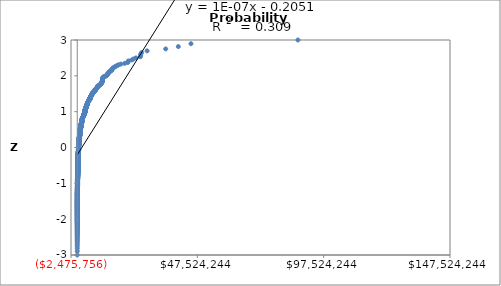
| Category | Normal Plot |
|---|---|
| 185.0 | -3.46 |
| 300.0 | -3.152 |
| 350.0 | -3 |
| 387.0 | -2.896 |
| 600.0 | -2.816 |
| 609.0 | -2.751 |
| 800.0 | -2.696 |
| 901.0 | -2.648 |
| 1362.0 | -2.605 |
| 1650.0 | -2.567 |
| 1725.0 | -2.532 |
| 1800.0 | -2.5 |
| 1860.0 | -2.471 |
| 2000.0 | -2.443 |
| 2304.0 | -2.417 |
| 2348.0 | -2.393 |
| 2800.0 | -2.37 |
| 2884.0 | -2.348 |
| 3000.0 | -2.327 |
| 3147.0 | -2.307 |
| 5000.0 | -2.288 |
| 5000.0 | -2.27 |
| 5000.0 | -2.253 |
| 5000.0 | -2.236 |
| 5333.0 | -2.22 |
| 6000.0 | -2.204 |
| 7500.0 | -2.189 |
| 7500.0 | -2.174 |
| 7629.0 | -2.16 |
| 8000.0 | -2.146 |
| 9950.0 | -2.133 |
| 9999.0 | -2.12 |
| 10000.0 | -2.107 |
| 10000.0 | -2.095 |
| 10000.0 | -2.083 |
| 10000.0 | -2.071 |
| 10000.0 | -2.06 |
| 10000.0 | -2.049 |
| 10000.0 | -2.038 |
| 10000.0 | -2.027 |
| 10000.0 | -2.017 |
| 10000.0 | -2.007 |
| 10000.0 | -1.997 |
| 10000.0 | -1.987 |
| 10000.0 | -1.977 |
| 10000.0 | -1.968 |
| 10000.0 | -1.958 |
| 10000.0 | -1.949 |
| 10000.0 | -1.94 |
| 10000.0 | -1.931 |
| 10000.0 | -1.923 |
| 10000.0 | -1.914 |
| 10000.0 | -1.906 |
| 10000.0 | -1.898 |
| 10000.0 | -1.89 |
| 10000.0 | -1.882 |
| 10500.0 | -1.874 |
| 10500.0 | -1.866 |
| 12000.0 | -1.858 |
| 12000.0 | -1.851 |
| 12327.0 | -1.843 |
| 13512.0 | -1.836 |
| 14657.0 | -1.829 |
| 14670.0 | -1.821 |
| 15000.0 | -1.814 |
| 15000.0 | -1.807 |
| 15213.0 | -1.801 |
| 15461.0 | -1.794 |
| 16100.0 | -1.787 |
| 17240.0 | -1.78 |
| 18750.0 | -1.774 |
| 19000.0 | -1.767 |
| 19490.0 | -1.761 |
| 20000.0 | -1.755 |
| 20000.0 | -1.748 |
| 20000.0 | -1.742 |
| 20000.0 | -1.736 |
| 20000.0 | -1.73 |
| 20000.0 | -1.724 |
| 21000.0 | -1.718 |
| 21000.0 | -1.712 |
| 21080.0 | -1.706 |
| 21563.0 | -1.7 |
| 22263.0 | -1.695 |
| 23000.0 | -1.689 |
| 23476.0 | -1.683 |
| 24000.0 | -1.678 |
| 24500.0 | -1.672 |
| 25000.0 | -1.667 |
| 25000.0 | -1.662 |
| 25000.0 | -1.656 |
| 25000.0 | -1.651 |
| 25000.0 | -1.646 |
| 25000.0 | -1.64 |
| 25000.0 | -1.635 |
| 25000.0 | -1.63 |
| 25000.0 | -1.625 |
| 25000.0 | -1.62 |
| 25000.0 | -1.615 |
| 25000.0 | -1.61 |
| 25000.0 | -1.605 |
| 25000.0 | -1.6 |
| 25000.0 | -1.595 |
| 25000.0 | -1.591 |
| 25000.0 | -1.586 |
| 26724.0 | -1.581 |
| 27473.0 | -1.576 |
| 27500.0 | -1.572 |
| 27727.0 | -1.567 |
| 27890.0 | -1.562 |
| 27945.0 | -1.558 |
| 30000.0 | -1.553 |
| 30000.0 | -1.549 |
| 30000.0 | -1.544 |
| 30000.0 | -1.54 |
| 30000.0 | -1.535 |
| 30000.0 | -1.531 |
| 30000.0 | -1.527 |
| 30000.0 | -1.522 |
| 30000.0 | -1.518 |
| 30000.0 | -1.514 |
| 30000.0 | -1.51 |
| 30250.0 | -1.505 |
| 31000.0 | -1.501 |
| 31715.0 | -1.497 |
| 35000.0 | -1.493 |
| 35000.0 | -1.489 |
| 35000.0 | -1.485 |
| 36018.0 | -1.481 |
| 36540.0 | -1.477 |
| 36540.0 | -1.473 |
| 38420.0 | -1.469 |
| 39280.0 | -1.465 |
| 39600.0 | -1.461 |
| 39900.0 | -1.457 |
| 40000.0 | -1.453 |
| 40000.0 | -1.449 |
| 40000.0 | -1.445 |
| 40000.0 | -1.441 |
| 40000.0 | -1.438 |
| 40100.0 | -1.434 |
| 40282.0 | -1.43 |
| 42000.0 | -1.426 |
| 42186.0 | -1.422 |
| 42500.0 | -1.419 |
| 45000.0 | -1.415 |
| 47810.0 | -1.411 |
| 47902.0 | -1.408 |
| 48449.0 | -1.404 |
| 48907.0 | -1.401 |
| 49500.0 | -1.397 |
| 49531.0 | -1.393 |
| 49864.0 | -1.39 |
| 49949.0 | -1.386 |
| 49996.0 | -1.383 |
| 50000.0 | -1.379 |
| 50000.0 | -1.376 |
| 50000.0 | -1.372 |
| 50000.0 | -1.369 |
| 50000.0 | -1.365 |
| 50000.0 | -1.362 |
| 50000.0 | -1.358 |
| 50000.0 | -1.355 |
| 50000.0 | -1.352 |
| 50000.0 | -1.348 |
| 50000.0 | -1.345 |
| 50000.0 | -1.342 |
| 50000.0 | -1.338 |
| 50000.0 | -1.335 |
| 50000.0 | -1.332 |
| 50000.0 | -1.328 |
| 50000.0 | -1.325 |
| 50000.0 | -1.322 |
| 50000.0 | -1.319 |
| 50000.0 | -1.315 |
| 50000.0 | -1.312 |
| 50000.0 | -1.309 |
| 50000.0 | -1.306 |
| 50000.0 | -1.303 |
| 50000.0 | -1.3 |
| 50000.0 | -1.296 |
| 50000.0 | -1.293 |
| 50000.0 | -1.29 |
| 50000.0 | -1.287 |
| 50000.0 | -1.284 |
| 50000.0 | -1.281 |
| 50000.0 | -1.278 |
| 50388.0 | -1.275 |
| 50527.0 | -1.272 |
| 51500.0 | -1.269 |
| 51700.0 | -1.266 |
| 53500.0 | -1.263 |
| 53763.0 | -1.26 |
| 54000.0 | -1.257 |
| 56245.0 | -1.254 |
| 59100.0 | -1.251 |
| 60000.0 | -1.248 |
| 60000.0 | -1.245 |
| 60000.0 | -1.242 |
| 60000.0 | -1.239 |
| 60000.0 | -1.236 |
| 60614.0 | -1.233 |
| 61050.0 | -1.23 |
| 61929.0 | -1.227 |
| 63300.0 | -1.225 |
| 64518.0 | -1.222 |
| 65000.0 | -1.219 |
| 66400.0 | -1.216 |
| 68500.0 | -1.213 |
| 68800.0 | -1.21 |
| 70000.0 | -1.208 |
| 70116.0 | -1.205 |
| 71166.0 | -1.202 |
| 74219.0 | -1.199 |
| 74290.0 | -1.196 |
| 74800.0 | -1.194 |
| 74871.0 | -1.191 |
| 74900.0 | -1.188 |
| 74963.0 | -1.185 |
| 74998.0 | -1.183 |
| 75000.0 | -1.18 |
| 75000.0 | -1.177 |
| 75000.0 | -1.175 |
| 75000.0 | -1.172 |
| 75000.0 | -1.169 |
| 75000.0 | -1.167 |
| 75000.0 | -1.164 |
| 75000.0 | -1.161 |
| 75000.0 | -1.159 |
| 75000.0 | -1.156 |
| 75000.0 | -1.153 |
| 75000.0 | -1.151 |
| 75000.0 | -1.148 |
| 75000.0 | -1.145 |
| 75000.0 | -1.143 |
| 75000.0 | -1.14 |
| 75000.0 | -1.138 |
| 75000.0 | -1.135 |
| 75000.0 | -1.133 |
| 75820.0 | -1.13 |
| 75970.0 | -1.127 |
| 77367.0 | -1.125 |
| 78200.0 | -1.122 |
| 79115.0 | -1.12 |
| 80000.0 | -1.117 |
| 80000.0 | -1.115 |
| 80000.0 | -1.112 |
| 80426.0 | -1.11 |
| 81000.0 | -1.107 |
| 82500.0 | -1.105 |
| 82800.0 | -1.102 |
| 85000.0 | -1.1 |
| 85000.0 | -1.097 |
| 85977.0 | -1.095 |
| 86000.0 | -1.092 |
| 87028.0 | -1.09 |
| 88000.0 | -1.087 |
| 90000.0 | -1.085 |
| 90000.0 | -1.083 |
| 91200.0 | -1.08 |
| 91300.0 | -1.078 |
| 93000.0 | -1.075 |
| 93452.0 | -1.073 |
| 94500.0 | -1.07 |
| 96000.0 | -1.068 |
| 98223.0 | -1.066 |
| 99080.0 | -1.063 |
| 99400.0 | -1.061 |
| 99500.0 | -1.059 |
| 99651.0 | -1.056 |
| 99858.0 | -1.054 |
| 99902.0 | -1.051 |
| 99964.0 | -1.049 |
| 99997.0 | -1.047 |
| 99998.0 | -1.044 |
| 99999.0 | -1.042 |
| 100000.0 | -1.04 |
| 100000.0 | -1.037 |
| 100000.0 | -1.035 |
| 100000.0 | -1.033 |
| 100000.0 | -1.031 |
| 100000.0 | -1.028 |
| 100000.0 | -1.026 |
| 100000.0 | -1.024 |
| 100000.0 | -1.021 |
| 100000.0 | -1.019 |
| 100000.0 | -1.017 |
| 100000.0 | -1.015 |
| 100000.0 | -1.012 |
| 100000.0 | -1.01 |
| 100000.0 | -1.008 |
| 100000.0 | -1.006 |
| 100000.0 | -1.003 |
| 100000.0 | -1.001 |
| 100000.0 | -0.999 |
| 100000.0 | -0.997 |
| 100000.0 | -0.994 |
| 100000.0 | -0.992 |
| 100000.0 | -0.99 |
| 100000.0 | -0.988 |
| 100000.0 | -0.986 |
| 100000.0 | -0.983 |
| 100000.0 | -0.981 |
| 100000.0 | -0.979 |
| 100000.0 | -0.977 |
| 100000.0 | -0.975 |
| 100000.0 | -0.972 |
| 100000.0 | -0.97 |
| 100000.0 | -0.968 |
| 100000.0 | -0.966 |
| 100000.0 | -0.964 |
| 100000.0 | -0.962 |
| 100000.0 | -0.96 |
| 100000.0 | -0.957 |
| 100000.0 | -0.955 |
| 100000.0 | -0.953 |
| 100000.0 | -0.951 |
| 100000.0 | -0.949 |
| 100000.0 | -0.947 |
| 100000.0 | -0.945 |
| 100000.0 | -0.943 |
| 100000.0 | -0.94 |
| 100000.0 | -0.938 |
| 100000.0 | -0.936 |
| 100000.0 | -0.934 |
| 100000.0 | -0.932 |
| 100000.0 | -0.93 |
| 100000.0 | -0.928 |
| 100000.0 | -0.926 |
| 100000.0 | -0.924 |
| 100000.0 | -0.922 |
| 100000.0 | -0.92 |
| 100000.0 | -0.918 |
| 100001.0 | -0.915 |
| 100001.0 | -0.913 |
| 100007.0 | -0.911 |
| 100013.0 | -0.909 |
| 100025.0 | -0.907 |
| 100034.0 | -0.905 |
| 100098.0 | -0.903 |
| 100239.0 | -0.901 |
| 101965.0 | -0.899 |
| 103000.0 | -0.897 |
| 104000.0 | -0.895 |
| 105000.0 | -0.893 |
| 106875.0 | -0.891 |
| 110000.0 | -0.889 |
| 110000.0 | -0.887 |
| 110000.0 | -0.885 |
| 110610.0 | -0.883 |
| 110700.0 | -0.881 |
| 111042.0 | -0.879 |
| 111376.0 | -0.877 |
| 115000.0 | -0.875 |
| 115000.0 | -0.873 |
| 115000.0 | -0.871 |
| 115650.0 | -0.869 |
| 119823.0 | -0.867 |
| 120458.0 | -0.865 |
| 121638.0 | -0.863 |
| 122213.0 | -0.861 |
| 122404.0 | -0.859 |
| 122981.0 | -0.857 |
| 124200.0 | -0.855 |
| 124757.0 | -0.853 |
| 125000.0 | -0.851 |
| 125000.0 | -0.85 |
| 125000.0 | -0.848 |
| 125000.0 | -0.846 |
| 125000.0 | -0.844 |
| 125000.0 | -0.842 |
| 125000.0 | -0.84 |
| 125000.0 | -0.838 |
| 125104.0 | -0.836 |
| 125962.0 | -0.834 |
| 129150.0 | -0.832 |
| 131250.0 | -0.83 |
| 131417.0 | -0.828 |
| 132000.0 | -0.826 |
| 132907.0 | -0.825 |
| 134000.0 | -0.823 |
| 134281.0 | -0.821 |
| 135000.0 | -0.819 |
| 135001.0 | -0.817 |
| 136400.0 | -0.815 |
| 137500.0 | -0.813 |
| 139438.0 | -0.811 |
| 139950.0 | -0.809 |
| 140000.0 | -0.808 |
| 140000.0 | -0.806 |
| 140000.0 | -0.804 |
| 143600.0 | -0.802 |
| 143973.0 | -0.8 |
| 144650.0 | -0.798 |
| 144917.0 | -0.796 |
| 146221.0 | -0.795 |
| 146337.0 | -0.793 |
| 147920.0 | -0.791 |
| 148930.0 | -0.789 |
| 149644.0 | -0.787 |
| 149733.0 | -0.785 |
| 149950.0 | -0.783 |
| 150000.0 | -0.782 |
| 150000.0 | -0.78 |
| 150000.0 | -0.778 |
| 150000.0 | -0.776 |
| 150000.0 | -0.774 |
| 150000.0 | -0.772 |
| 150000.0 | -0.771 |
| 150000.0 | -0.769 |
| 150000.0 | -0.767 |
| 150000.0 | -0.765 |
| 150000.0 | -0.763 |
| 150000.0 | -0.762 |
| 150000.0 | -0.76 |
| 150000.0 | -0.758 |
| 150000.0 | -0.756 |
| 150000.0 | -0.754 |
| 150000.0 | -0.753 |
| 150000.0 | -0.751 |
| 150000.0 | -0.749 |
| 150000.0 | -0.747 |
| 150000.0 | -0.745 |
| 150000.0 | -0.744 |
| 150003.0 | -0.742 |
| 150834.0 | -0.74 |
| 151019.0 | -0.738 |
| 151125.0 | -0.737 |
| 151200.0 | -0.735 |
| 151431.0 | -0.733 |
| 152232.0 | -0.731 |
| 152513.0 | -0.729 |
| 152900.0 | -0.728 |
| 154347.0 | -0.726 |
| 156000.0 | -0.724 |
| 158400.0 | -0.722 |
| 160400.0 | -0.721 |
| 160950.0 | -0.719 |
| 168755.0 | -0.717 |
| 170000.0 | -0.715 |
| 170000.0 | -0.714 |
| 170000.0 | -0.712 |
| 170023.0 | -0.71 |
| 171000.0 | -0.708 |
| 172000.0 | -0.707 |
| 175000.0 | -0.705 |
| 175000.0 | -0.703 |
| 175000.0 | -0.701 |
| 175000.0 | -0.7 |
| 175644.0 | -0.698 |
| 179015.0 | -0.696 |
| 179482.0 | -0.695 |
| 179600.0 | -0.693 |
| 180000.0 | -0.691 |
| 180000.0 | -0.689 |
| 180000.0 | -0.688 |
| 182000.0 | -0.686 |
| 182600.0 | -0.684 |
| 185840.0 | -0.683 |
| 186792.0 | -0.681 |
| 187000.0 | -0.679 |
| 189275.0 | -0.677 |
| 189886.0 | -0.676 |
| 189956.0 | -0.674 |
| 191600.0 | -0.672 |
| 191950.0 | -0.671 |
| 195967.0 | -0.669 |
| 198000.0 | -0.667 |
| 198206.0 | -0.666 |
| 198704.0 | -0.664 |
| 199665.0 | -0.662 |
| 199984.0 | -0.661 |
| 199990.0 | -0.659 |
| 200000.0 | -0.657 |
| 200000.0 | -0.656 |
| 200000.0 | -0.654 |
| 200000.0 | -0.652 |
| 200000.0 | -0.65 |
| 200000.0 | -0.649 |
| 200000.0 | -0.647 |
| 200000.0 | -0.645 |
| 200000.0 | -0.644 |
| 200000.0 | -0.642 |
| 200000.0 | -0.64 |
| 200000.0 | -0.639 |
| 200000.0 | -0.637 |
| 200000.0 | -0.636 |
| 200000.0 | -0.634 |
| 200000.0 | -0.632 |
| 200000.0 | -0.631 |
| 200000.0 | -0.629 |
| 200000.0 | -0.627 |
| 200000.0 | -0.626 |
| 200000.0 | -0.624 |
| 200000.0 | -0.622 |
| 200000.0 | -0.621 |
| 200000.0 | -0.619 |
| 200000.0 | -0.617 |
| 200000.0 | -0.616 |
| 200000.0 | -0.614 |
| 200000.0 | -0.613 |
| 200000.0 | -0.611 |
| 200001.0 | -0.609 |
| 200002.0 | -0.608 |
| 200360.0 | -0.606 |
| 200360.0 | -0.604 |
| 200650.0 | -0.603 |
| 200800.0 | -0.601 |
| 201600.0 | -0.599 |
| 201700.0 | -0.598 |
| 202500.0 | -0.596 |
| 204988.0 | -0.595 |
| 208000.0 | -0.593 |
| 208950.0 | -0.591 |
| 209200.0 | -0.59 |
| 210000.0 | -0.588 |
| 210000.0 | -0.587 |
| 210000.0 | -0.585 |
| 210000.0 | -0.583 |
| 210360.0 | -0.582 |
| 211795.0 | -0.58 |
| 212000.0 | -0.579 |
| 213000.0 | -0.577 |
| 213000.0 | -0.575 |
| 213750.0 | -0.574 |
| 214808.0 | -0.572 |
| 215000.0 | -0.571 |
| 215000.0 | -0.569 |
| 216000.0 | -0.567 |
| 217200.0 | -0.566 |
| 218567.0 | -0.564 |
| 221250.0 | -0.563 |
| 221755.0 | -0.561 |
| 222000.0 | -0.559 |
| 224000.0 | -0.558 |
| 224030.0 | -0.556 |
| 225000.0 | -0.555 |
| 225000.0 | -0.553 |
| 227200.0 | -0.552 |
| 227352.0 | -0.55 |
| 228150.0 | -0.548 |
| 230000.0 | -0.547 |
| 231382.0 | -0.545 |
| 231846.0 | -0.544 |
| 234450.0 | -0.542 |
| 235000.0 | -0.541 |
| 235150.0 | -0.539 |
| 238080.0 | -0.537 |
| 238500.0 | -0.536 |
| 239796.0 | -0.534 |
| 240000.0 | -0.533 |
| 240000.0 | -0.531 |
| 241747.0 | -0.53 |
| 242000.0 | -0.528 |
| 242580.0 | -0.527 |
| 244733.0 | -0.525 |
| 244924.0 | -0.523 |
| 245534.0 | -0.522 |
| 246070.0 | -0.52 |
| 247333.0 | -0.519 |
| 247465.0 | -0.517 |
| 248250.0 | -0.516 |
| 248343.0 | -0.514 |
| 248760.0 | -0.513 |
| 249113.0 | -0.511 |
| 249290.0 | -0.51 |
| 249396.0 | -0.508 |
| 249445.0 | -0.506 |
| 249471.0 | -0.505 |
| 249482.0 | -0.503 |
| 249505.0 | -0.502 |
| 249612.0 | -0.5 |
| 249700.0 | -0.499 |
| 249727.0 | -0.497 |
| 249808.0 | -0.496 |
| 249826.0 | -0.494 |
| 249830.0 | -0.493 |
| 249855.0 | -0.491 |
| 249939.0 | -0.49 |
| 249994.0 | -0.488 |
| 250000.0 | -0.487 |
| 250000.0 | -0.485 |
| 250000.0 | -0.484 |
| 250000.0 | -0.482 |
| 250000.0 | -0.481 |
| 250000.0 | -0.479 |
| 250000.0 | -0.477 |
| 250000.0 | -0.476 |
| 250000.0 | -0.474 |
| 250000.0 | -0.473 |
| 250000.0 | -0.471 |
| 250000.0 | -0.47 |
| 250000.0 | -0.468 |
| 250000.0 | -0.467 |
| 250000.0 | -0.465 |
| 250000.0 | -0.464 |
| 250000.0 | -0.462 |
| 250000.0 | -0.461 |
| 250000.0 | -0.459 |
| 250000.0 | -0.458 |
| 250000.0 | -0.456 |
| 250000.0 | -0.455 |
| 250000.0 | -0.453 |
| 250000.0 | -0.452 |
| 250000.0 | -0.45 |
| 250000.0 | -0.449 |
| 250000.0 | -0.447 |
| 250000.0 | -0.446 |
| 250000.0 | -0.444 |
| 250000.0 | -0.443 |
| 250000.0 | -0.441 |
| 250000.0 | -0.44 |
| 250000.0 | -0.438 |
| 250000.0 | -0.437 |
| 250000.0 | -0.435 |
| 250000.0 | -0.434 |
| 250000.0 | -0.432 |
| 250000.0 | -0.431 |
| 250000.0 | -0.429 |
| 250000.0 | -0.428 |
| 250000.0 | -0.427 |
| 250000.0 | -0.425 |
| 250249.0 | -0.424 |
| 250400.0 | -0.422 |
| 250669.0 | -0.421 |
| 250675.0 | -0.419 |
| 253482.0 | -0.418 |
| 254400.0 | -0.416 |
| 255394.0 | -0.415 |
| 257391.0 | -0.413 |
| 257675.0 | -0.412 |
| 259895.0 | -0.41 |
| 260000.0 | -0.409 |
| 260000.0 | -0.407 |
| 260760.0 | -0.406 |
| 262003.0 | -0.404 |
| 262500.0 | -0.403 |
| 263400.0 | -0.401 |
| 264500.0 | -0.4 |
| 270000.0 | -0.399 |
| 270492.0 | -0.397 |
| 272914.0 | -0.396 |
| 274999.0 | -0.394 |
| 275000.0 | -0.393 |
| 277044.0 | -0.391 |
| 280000.0 | -0.39 |
| 281217.0 | -0.388 |
| 281800.0 | -0.387 |
| 285368.0 | -0.385 |
| 285714.0 | -0.384 |
| 286500.0 | -0.382 |
| 286600.0 | -0.381 |
| 289899.0 | -0.38 |
| 289937.0 | -0.378 |
| 290939.0 | -0.377 |
| 291070.0 | -0.375 |
| 293024.0 | -0.374 |
| 296000.0 | -0.372 |
| 297045.0 | -0.371 |
| 297800.0 | -0.369 |
| 298000.0 | -0.368 |
| 298176.0 | -0.367 |
| 299263.0 | -0.365 |
| 299363.0 | -0.364 |
| 299384.0 | -0.362 |
| 299444.0 | -0.361 |
| 299902.0 | -0.359 |
| 299985.0 | -0.358 |
| 300000.0 | -0.356 |
| 300000.0 | -0.355 |
| 300000.0 | -0.354 |
| 300000.0 | -0.352 |
| 300000.0 | -0.351 |
| 300000.0 | -0.349 |
| 300000.0 | -0.348 |
| 300000.0 | -0.346 |
| 300000.0 | -0.345 |
| 300000.0 | -0.343 |
| 300000.0 | -0.342 |
| 300000.0 | -0.341 |
| 300000.0 | -0.339 |
| 300000.0 | -0.338 |
| 300000.0 | -0.336 |
| 300000.0 | -0.335 |
| 300000.0 | -0.333 |
| 300000.0 | -0.332 |
| 300000.0 | -0.331 |
| 300000.0 | -0.329 |
| 300000.0 | -0.328 |
| 300000.0 | -0.326 |
| 300000.0 | -0.325 |
| 300000.0 | -0.323 |
| 300000.0 | -0.322 |
| 300000.0 | -0.321 |
| 300000.0 | -0.319 |
| 300000.0 | -0.318 |
| 300000.0 | -0.316 |
| 300000.0 | -0.315 |
| 300000.0 | -0.313 |
| 300000.0 | -0.312 |
| 300000.0 | -0.311 |
| 300000.0 | -0.309 |
| 300000.0 | -0.308 |
| 300000.0 | -0.306 |
| 300000.0 | -0.305 |
| 300000.0 | -0.304 |
| 300000.0 | -0.302 |
| 300000.0 | -0.301 |
| 300008.0 | -0.299 |
| 300013.0 | -0.298 |
| 300250.0 | -0.296 |
| 300653.0 | -0.295 |
| 301451.0 | -0.294 |
| 302425.0 | -0.292 |
| 303850.0 | -0.291 |
| 306485.0 | -0.289 |
| 306500.0 | -0.288 |
| 308000.0 | -0.287 |
| 309554.0 | -0.285 |
| 310500.0 | -0.284 |
| 313000.0 | -0.282 |
| 314110.0 | -0.281 |
| 314996.0 | -0.28 |
| 319450.0 | -0.278 |
| 320000.0 | -0.277 |
| 322500.0 | -0.275 |
| 325000.0 | -0.274 |
| 325000.0 | -0.273 |
| 326000.0 | -0.271 |
| 328000.0 | -0.27 |
| 329034.0 | -0.268 |
| 330000.0 | -0.267 |
| 330008.0 | -0.266 |
| 330781.0 | -0.264 |
| 331512.0 | -0.263 |
| 331678.0 | -0.261 |
| 332992.0 | -0.26 |
| 333860.0 | -0.259 |
| 334100.0 | -0.257 |
| 334610.0 | -0.256 |
| 337000.0 | -0.254 |
| 341000.0 | -0.253 |
| 342576.0 | -0.252 |
| 345592.0 | -0.25 |
| 345592.0 | -0.249 |
| 346644.0 | -0.247 |
| 348288.0 | -0.246 |
| 350000.0 | -0.245 |
| 350000.0 | -0.243 |
| 350000.0 | -0.242 |
| 350000.0 | -0.24 |
| 350000.0 | -0.239 |
| 350000.0 | -0.238 |
| 350000.0 | -0.236 |
| 350238.0 | -0.235 |
| 350253.0 | -0.233 |
| 353977.0 | -0.232 |
| 354993.0 | -0.231 |
| 355460.0 | -0.229 |
| 356054.0 | -0.228 |
| 358915.0 | -0.226 |
| 361927.0 | -0.225 |
| 365000.0 | -0.224 |
| 369000.0 | -0.222 |
| 369623.0 | -0.221 |
| 370938.0 | -0.22 |
| 375000.0 | -0.218 |
| 375030.0 | -0.217 |
| 377646.0 | -0.215 |
| 378013.0 | -0.214 |
| 378500.0 | -0.213 |
| 383465.0 | -0.211 |
| 385801.0 | -0.21 |
| 386560.0 | -0.208 |
| 391089.0 | -0.207 |
| 395836.0 | -0.206 |
| 395931.0 | -0.204 |
| 396262.0 | -0.203 |
| 397036.0 | -0.202 |
| 397590.0 | -0.2 |
| 398534.0 | -0.199 |
| 398704.0 | -0.197 |
| 399471.0 | -0.196 |
| 399827.0 | -0.195 |
| 399953.0 | -0.193 |
| 399968.0 | -0.192 |
| 400000.0 | -0.191 |
| 400000.0 | -0.189 |
| 400000.0 | -0.188 |
| 400000.0 | -0.186 |
| 400000.0 | -0.185 |
| 400000.0 | -0.184 |
| 400000.0 | -0.182 |
| 400000.0 | -0.181 |
| 400000.0 | -0.18 |
| 400000.0 | -0.178 |
| 400000.0 | -0.177 |
| 400000.0 | -0.175 |
| 400000.0 | -0.174 |
| 400000.0 | -0.173 |
| 400000.0 | -0.171 |
| 400366.0 | -0.17 |
| 400381.0 | -0.169 |
| 405698.0 | -0.167 |
| 410929.0 | -0.166 |
| 411722.0 | -0.164 |
| 417517.0 | -0.163 |
| 417697.0 | -0.162 |
| 420002.0 | -0.16 |
| 420632.0 | -0.159 |
| 421752.0 | -0.158 |
| 423500.0 | -0.156 |
| 425000.0 | -0.155 |
| 425000.0 | -0.153 |
| 425000.0 | -0.152 |
| 427000.0 | -0.151 |
| 427000.0 | -0.149 |
| 430000.0 | -0.148 |
| 432898.0 | -0.147 |
| 436800.0 | -0.145 |
| 437807.0 | -0.144 |
| 442320.0 | -0.143 |
| 442884.0 | -0.141 |
| 445040.0 | -0.14 |
| 446564.0 | -0.138 |
| 449300.0 | -0.137 |
| 449750.0 | -0.136 |
| 450000.0 | -0.134 |
| 450000.0 | -0.133 |
| 450000.0 | -0.132 |
| 450000.0 | -0.13 |
| 450000.0 | -0.129 |
| 450000.0 | -0.128 |
| 450000.0 | -0.126 |
| 450000.0 | -0.125 |
| 450223.0 | -0.123 |
| 450675.0 | -0.122 |
| 455394.0 | -0.121 |
| 460000.0 | -0.119 |
| 464984.0 | -0.118 |
| 468433.0 | -0.117 |
| 468500.0 | -0.115 |
| 473573.0 | -0.114 |
| 475000.0 | -0.113 |
| 475000.0 | -0.111 |
| 475077.0 | -0.11 |
| 476553.0 | -0.108 |
| 476610.0 | -0.107 |
| 476683.0 | -0.106 |
| 477691.0 | -0.104 |
| 479000.0 | -0.103 |
| 479602.0 | -0.102 |
| 480000.0 | -0.1 |
| 481844.0 | -0.099 |
| 484948.0 | -0.098 |
| 487071.0 | -0.096 |
| 487475.0 | -0.095 |
| 490021.0 | -0.093 |
| 491310.0 | -0.092 |
| 494826.0 | -0.091 |
| 494933.0 | -0.089 |
| 494953.0 | -0.088 |
| 495337.0 | -0.087 |
| 496776.0 | -0.085 |
| 497499.0 | -0.084 |
| 497613.0 | -0.083 |
| 497639.0 | -0.081 |
| 497684.0 | -0.08 |
| 497752.0 | -0.079 |
| 497878.0 | -0.077 |
| 498055.0 | -0.076 |
| 498724.0 | -0.074 |
| 498857.0 | -0.073 |
| 499375.0 | -0.072 |
| 499547.0 | -0.07 |
| 499730.0 | -0.069 |
| 499783.0 | -0.068 |
| 499800.0 | -0.066 |
| 499951.0 | -0.065 |
| 499962.0 | -0.064 |
| 499989.0 | -0.062 |
| 499996.0 | -0.061 |
| 499997.0 | -0.06 |
| 500000.0 | -0.058 |
| 500000.0 | -0.057 |
| 500000.0 | -0.055 |
| 500000.0 | -0.054 |
| 500000.0 | -0.053 |
| 500000.0 | -0.051 |
| 500000.0 | -0.05 |
| 500000.0 | -0.049 |
| 500000.0 | -0.047 |
| 500000.0 | -0.046 |
| 500000.0 | -0.045 |
| 500000.0 | -0.043 |
| 500000.0 | -0.042 |
| 500000.0 | -0.041 |
| 500000.0 | -0.039 |
| 500000.0 | -0.038 |
| 500000.0 | -0.037 |
| 500000.0 | -0.035 |
| 500000.0 | -0.034 |
| 500000.0 | -0.032 |
| 500000.0 | -0.031 |
| 500000.0 | -0.03 |
| 500000.0 | -0.028 |
| 500000.0 | -0.027 |
| 500000.0 | -0.026 |
| 500000.0 | -0.024 |
| 500000.0 | -0.023 |
| 500000.0 | -0.022 |
| 500000.0 | -0.02 |
| 500000.0 | -0.019 |
| 500000.0 | -0.018 |
| 500000.0 | -0.016 |
| 500000.0 | -0.015 |
| 500000.0 | -0.014 |
| 500000.0 | -0.012 |
| 500000.0 | -0.011 |
| 500000.0 | -0.009 |
| 500000.0 | -0.008 |
| 500000.0 | -0.007 |
| 500000.0 | -0.005 |
| 500000.0 | -0.004 |
| 500000.0 | -0.003 |
| 500000.0 | -0.001 |
| 500000.0 | 0 |
| 500000.0 | 0.001 |
| 500000.0 | 0.003 |
| 500000.0 | 0.004 |
| 500000.0 | 0.005 |
| 500000.0 | 0.007 |
| 500000.0 | 0.008 |
| 500000.0 | 0.009 |
| 500000.0 | 0.011 |
| 500000.0 | 0.012 |
| 500000.0 | 0.014 |
| 500000.0 | 0.015 |
| 500000.0 | 0.016 |
| 500000.0 | 0.018 |
| 500000.0 | 0.019 |
| 500125.0 | 0.02 |
| 500187.0 | 0.022 |
| 500422.0 | 0.023 |
| 500543.0 | 0.024 |
| 500906.0 | 0.026 |
| 501485.0 | 0.027 |
| 501580.0 | 0.028 |
| 505500.0 | 0.03 |
| 505533.0 | 0.031 |
| 506504.0 | 0.032 |
| 511359.0 | 0.034 |
| 513219.0 | 0.035 |
| 513750.0 | 0.037 |
| 514872.0 | 0.038 |
| 517500.0 | 0.039 |
| 517670.0 | 0.041 |
| 517860.0 | 0.042 |
| 520446.0 | 0.043 |
| 525000.0 | 0.045 |
| 526960.0 | 0.046 |
| 531131.0 | 0.047 |
| 538967.0 | 0.049 |
| 539334.0 | 0.05 |
| 540000.0 | 0.051 |
| 546864.0 | 0.053 |
| 549489.0 | 0.054 |
| 550000.0 | 0.055 |
| 550000.0 | 0.057 |
| 550000.0 | 0.058 |
| 550000.0 | 0.06 |
| 550844.0 | 0.061 |
| 551336.0 | 0.062 |
| 553493.0 | 0.064 |
| 556006.0 | 0.065 |
| 557168.0 | 0.066 |
| 557743.0 | 0.068 |
| 558000.0 | 0.069 |
| 560000.0 | 0.07 |
| 563611.0 | 0.072 |
| 564323.0 | 0.073 |
| 566023.0 | 0.074 |
| 572533.0 | 0.076 |
| 574060.0 | 0.077 |
| 575000.0 | 0.079 |
| 576191.0 | 0.08 |
| 580000.0 | 0.081 |
| 582637.0 | 0.083 |
| 583531.0 | 0.084 |
| 583800.0 | 0.085 |
| 588559.0 | 0.087 |
| 590525.0 | 0.088 |
| 594035.0 | 0.089 |
| 595627.0 | 0.091 |
| 595859.0 | 0.092 |
| 597077.0 | 0.093 |
| 597228.0 | 0.095 |
| 599016.0 | 0.096 |
| 599947.0 | 0.098 |
| 600000.0 | 0.099 |
| 600000.0 | 0.1 |
| 600000.0 | 0.102 |
| 600000.0 | 0.103 |
| 600000.0 | 0.104 |
| 600000.0 | 0.106 |
| 600000.0 | 0.107 |
| 600000.0 | 0.108 |
| 600000.0 | 0.11 |
| 600000.0 | 0.111 |
| 600000.0 | 0.113 |
| 600223.0 | 0.114 |
| 600759.0 | 0.115 |
| 604973.0 | 0.117 |
| 606608.0 | 0.118 |
| 610819.0 | 0.119 |
| 614954.0 | 0.121 |
| 615590.0 | 0.122 |
| 621265.0 | 0.123 |
| 623035.0 | 0.125 |
| 625000.0 | 0.126 |
| 628761.0 | 0.128 |
| 635003.0 | 0.129 |
| 637532.0 | 0.13 |
| 637532.0 | 0.132 |
| 638620.0 | 0.133 |
| 642753.0 | 0.134 |
| 643881.0 | 0.136 |
| 646851.0 | 0.137 |
| 647000.0 | 0.138 |
| 650000.0 | 0.14 |
| 650000.0 | 0.141 |
| 650000.0 | 0.143 |
| 650000.0 | 0.144 |
| 650000.0 | 0.145 |
| 650000.0 | 0.147 |
| 650000.0 | 0.148 |
| 650000.0 | 0.149 |
| 652255.0 | 0.151 |
| 652493.0 | 0.152 |
| 653077.0 | 0.153 |
| 659788.0 | 0.155 |
| 667235.0 | 0.156 |
| 670156.0 | 0.158 |
| 670387.0 | 0.159 |
| 671361.0 | 0.16 |
| 672000.0 | 0.162 |
| 673378.0 | 0.163 |
| 674472.0 | 0.164 |
| 675000.0 | 0.166 |
| 675000.0 | 0.167 |
| 675000.0 | 0.169 |
| 685000.0 | 0.17 |
| 686784.0 | 0.171 |
| 689738.0 | 0.173 |
| 697310.0 | 0.174 |
| 698587.0 | 0.175 |
| 699104.0 | 0.177 |
| 700000.0 | 0.178 |
| 700000.0 | 0.18 |
| 700000.0 | 0.181 |
| 700000.0 | 0.182 |
| 700250.0 | 0.184 |
| 703737.0 | 0.185 |
| 721736.0 | 0.186 |
| 725000.0 | 0.188 |
| 726000.0 | 0.189 |
| 729916.0 | 0.191 |
| 733195.0 | 0.192 |
| 733793.0 | 0.193 |
| 742223.0 | 0.195 |
| 742996.0 | 0.196 |
| 743331.0 | 0.197 |
| 743550.0 | 0.199 |
| 744703.0 | 0.2 |
| 744844.0 | 0.202 |
| 750000.0 | 0.203 |
| 750000.0 | 0.204 |
| 750000.0 | 0.206 |
| 750000.0 | 0.207 |
| 750000.0 | 0.208 |
| 750000.0 | 0.21 |
| 750000.0 | 0.211 |
| 750000.0 | 0.213 |
| 750000.0 | 0.214 |
| 750000.0 | 0.215 |
| 750000.0 | 0.217 |
| 750000.0 | 0.218 |
| 750000.0 | 0.22 |
| 750000.0 | 0.221 |
| 750000.0 | 0.222 |
| 750000.0 | 0.224 |
| 750584.0 | 0.225 |
| 750772.0 | 0.226 |
| 751872.0 | 0.228 |
| 752332.0 | 0.229 |
| 753624.0 | 0.231 |
| 758910.0 | 0.232 |
| 760000.0 | 0.233 |
| 762476.0 | 0.235 |
| 768112.0 | 0.236 |
| 768794.0 | 0.238 |
| 775000.0 | 0.239 |
| 785194.0 | 0.24 |
| 791000.0 | 0.242 |
| 792216.0 | 0.243 |
| 797170.0 | 0.245 |
| 798160.0 | 0.246 |
| 798408.0 | 0.247 |
| 799221.0 | 0.249 |
| 799673.0 | 0.25 |
| 799759.0 | 0.252 |
| 799825.0 | 0.253 |
| 800000.0 | 0.254 |
| 800000.0 | 0.256 |
| 800000.0 | 0.257 |
| 800000.0 | 0.259 |
| 800000.0 | 0.26 |
| 800000.0 | 0.261 |
| 800000.0 | 0.263 |
| 800000.0 | 0.264 |
| 801808.0 | 0.266 |
| 809467.0 | 0.267 |
| 818471.0 | 0.268 |
| 820465.0 | 0.27 |
| 828653.0 | 0.271 |
| 831395.0 | 0.273 |
| 832969.0 | 0.274 |
| 837355.0 | 0.275 |
| 840000.0 | 0.277 |
| 840000.0 | 0.278 |
| 840000.0 | 0.28 |
| 850000.0 | 0.281 |
| 850000.0 | 0.282 |
| 850000.0 | 0.284 |
| 850000.0 | 0.285 |
| 855766.0 | 0.287 |
| 871202.0 | 0.288 |
| 871845.0 | 0.289 |
| 879000.0 | 0.291 |
| 879810.0 | 0.292 |
| 881000.0 | 0.294 |
| 883200.0 | 0.295 |
| 884417.0 | 0.296 |
| 885000.0 | 0.298 |
| 885130.0 | 0.299 |
| 886381.0 | 0.301 |
| 888638.0 | 0.302 |
| 892500.0 | 0.304 |
| 899021.0 | 0.305 |
| 899875.0 | 0.306 |
| 900000.0 | 0.308 |
| 900000.0 | 0.309 |
| 900000.0 | 0.311 |
| 900000.0 | 0.312 |
| 900000.0 | 0.313 |
| 900000.0 | 0.315 |
| 900000.0 | 0.316 |
| 900488.0 | 0.318 |
| 900900.0 | 0.319 |
| 910000.0 | 0.321 |
| 911500.0 | 0.322 |
| 911500.0 | 0.323 |
| 920000.0 | 0.325 |
| 922000.0 | 0.326 |
| 925111.0 | 0.328 |
| 931137.0 | 0.329 |
| 933529.0 | 0.331 |
| 937088.0 | 0.332 |
| 940148.0 | 0.333 |
| 942527.0 | 0.335 |
| 945261.0 | 0.336 |
| 950000.0 | 0.338 |
| 950000.0 | 0.339 |
| 950000.0 | 0.341 |
| 950548.0 | 0.342 |
| 951293.0 | 0.343 |
| 953184.0 | 0.345 |
| 959116.0 | 0.346 |
| 959373.0 | 0.348 |
| 959477.0 | 0.349 |
| 959989.0 | 0.351 |
| 960000.0 | 0.352 |
| 960000.0 | 0.354 |
| 965190.0 | 0.355 |
| 965738.0 | 0.356 |
| 971421.0 | 0.358 |
| 973166.0 | 0.359 |
| 974941.0 | 0.361 |
| 975000.0 | 0.362 |
| 978105.0 | 0.364 |
| 979000.0 | 0.365 |
| 981000.0 | 0.367 |
| 984559.0 | 0.368 |
| 986452.0 | 0.369 |
| 987000.0 | 0.371 |
| 987579.0 | 0.372 |
| 988320.0 | 0.374 |
| 989319.0 | 0.375 |
| 989929.0 | 0.377 |
| 992800.0 | 0.378 |
| 993219.0 | 0.38 |
| 993317.0 | 0.381 |
| 996185.0 | 0.382 |
| 997500.0 | 0.384 |
| 997614.0 | 0.385 |
| 998150.0 | 0.387 |
| 998221.0 | 0.388 |
| 999406.0 | 0.39 |
| 999566.0 | 0.391 |
| 999698.0 | 0.393 |
| 999795.0 | 0.394 |
| 999900.0 | 0.396 |
| 1000000.0 | 0.397 |
| 1000000.0 | 0.399 |
| 1000000.0 | 0.4 |
| 1000000.0 | 0.401 |
| 1000000.0 | 0.403 |
| 1000000.0 | 0.404 |
| 1000000.0 | 0.406 |
| 1000000.0 | 0.407 |
| 1000000.0 | 0.409 |
| 1000000.0 | 0.41 |
| 1000000.0 | 0.412 |
| 1000000.0 | 0.413 |
| 1000000.0 | 0.415 |
| 1000000.0 | 0.416 |
| 1000000.0 | 0.418 |
| 1000000.0 | 0.419 |
| 1000000.0 | 0.421 |
| 1000000.0 | 0.422 |
| 1000000.0 | 0.424 |
| 1000000.0 | 0.425 |
| 1000000.0 | 0.427 |
| 1000001.0 | 0.428 |
| 1000002.0 | 0.429 |
| 1000330.0 | 0.431 |
| 1000561.0 | 0.432 |
| 1001363.0 | 0.434 |
| 1002000.0 | 0.435 |
| 1004719.0 | 0.437 |
| 1021000.0 | 0.438 |
| 1038029.0 | 0.44 |
| 1047928.0 | 0.441 |
| 1053150.0 | 0.443 |
| 1054143.0 | 0.444 |
| 1058313.0 | 0.446 |
| 1068280.0 | 0.447 |
| 1070243.0 | 0.449 |
| 1076400.0 | 0.45 |
| 1077960.0 | 0.452 |
| 1095000.0 | 0.453 |
| 1099687.0 | 0.455 |
| 1100000.0 | 0.456 |
| 1100000.0 | 0.458 |
| 1100000.0 | 0.459 |
| 1111250.0 | 0.461 |
| 1112000.0 | 0.462 |
| 1116000.0 | 0.464 |
| 1118424.0 | 0.465 |
| 1123216.0 | 0.467 |
| 1125270.0 | 0.468 |
| 1130000.0 | 0.47 |
| 1137632.0 | 0.471 |
| 1144856.0 | 0.473 |
| 1150000.0 | 0.474 |
| 1153442.0 | 0.476 |
| 1159989.0 | 0.477 |
| 1163695.0 | 0.479 |
| 1168734.0 | 0.481 |
| 1172327.0 | 0.482 |
| 1175000.0 | 0.484 |
| 1179770.0 | 0.485 |
| 1181375.0 | 0.487 |
| 1189756.0 | 0.488 |
| 1194000.0 | 0.49 |
| 1195639.0 | 0.491 |
| 1200000.0 | 0.493 |
| 1200000.0 | 0.494 |
| 1200000.0 | 0.496 |
| 1200000.0 | 0.497 |
| 1200000.0 | 0.499 |
| 1200000.0 | 0.5 |
| 1200000.0 | 0.502 |
| 1200007.0 | 0.503 |
| 1205600.0 | 0.505 |
| 1221800.0 | 0.506 |
| 1224953.0 | 0.508 |
| 1229467.0 | 0.51 |
| 1229730.0 | 0.511 |
| 1233281.0 | 0.513 |
| 1235787.0 | 0.514 |
| 1243039.0 | 0.516 |
| 1245813.0 | 0.517 |
| 1249040.0 | 0.519 |
| 1250000.0 | 0.52 |
| 1250000.0 | 0.522 |
| 1254000.0 | 0.523 |
| 1255420.0 | 0.525 |
| 1255420.0 | 0.527 |
| 1257615.0 | 0.528 |
| 1261087.0 | 0.53 |
| 1271400.0 | 0.531 |
| 1277648.0 | 0.533 |
| 1293000.0 | 0.534 |
| 1293904.0 | 0.536 |
| 1300000.0 | 0.537 |
| 1300000.0 | 0.539 |
| 1300010.0 | 0.541 |
| 1303920.0 | 0.542 |
| 1307738.0 | 0.544 |
| 1309409.0 | 0.545 |
| 1312500.0 | 0.547 |
| 1348323.0 | 0.548 |
| 1350000.0 | 0.55 |
| 1357229.0 | 0.552 |
| 1365117.0 | 0.553 |
| 1365913.0 | 0.555 |
| 1370000.0 | 0.556 |
| 1396639.0 | 0.558 |
| 1397601.0 | 0.559 |
| 1400000.0 | 0.561 |
| 1418622.0 | 0.563 |
| 1420000.0 | 0.564 |
| 1422627.0 | 0.566 |
| 1425000.0 | 0.567 |
| 1439000.0 | 0.569 |
| 1439034.0 | 0.571 |
| 1440000.0 | 0.572 |
| 1440590.0 | 0.574 |
| 1445269.0 | 0.575 |
| 1449039.0 | 0.577 |
| 1453832.0 | 0.579 |
| 1463346.0 | 0.58 |
| 1464667.0 | 0.582 |
| 1465000.0 | 0.583 |
| 1465525.0 | 0.585 |
| 1466983.0 | 0.587 |
| 1470457.0 | 0.588 |
| 1475261.0 | 0.59 |
| 1486321.0 | 0.591 |
| 1498063.0 | 0.593 |
| 1500000.0 | 0.595 |
| 1500000.0 | 0.596 |
| 1500000.0 | 0.598 |
| 1500000.0 | 0.599 |
| 1500000.0 | 0.601 |
| 1500000.0 | 0.603 |
| 1500000.0 | 0.604 |
| 1500000.0 | 0.606 |
| 1500000.0 | 0.608 |
| 1500000.0 | 0.609 |
| 1500000.0 | 0.611 |
| 1500000.0 | 0.613 |
| 1500000.0 | 0.614 |
| 1500003.0 | 0.616 |
| 1500055.0 | 0.617 |
| 1500596.0 | 0.619 |
| 1501431.0 | 0.621 |
| 1501900.0 | 0.622 |
| 1508882.0 | 0.624 |
| 1511578.0 | 0.626 |
| 1511927.0 | 0.627 |
| 1521971.0 | 0.629 |
| 1540002.0 | 0.631 |
| 1541091.0 | 0.632 |
| 1544776.0 | 0.634 |
| 1550160.0 | 0.636 |
| 1557098.0 | 0.637 |
| 1557444.0 | 0.639 |
| 1570000.0 | 0.64 |
| 1572810.0 | 0.642 |
| 1576958.0 | 0.644 |
| 1577725.0 | 0.645 |
| 1579999.0 | 0.647 |
| 1590031.0 | 0.649 |
| 1596000.0 | 0.65 |
| 1600000.0 | 0.652 |
| 1600000.0 | 0.654 |
| 1600000.0 | 0.656 |
| 1602380.0 | 0.657 |
| 1603000.0 | 0.659 |
| 1603500.0 | 0.661 |
| 1605669.0 | 0.662 |
| 1612877.0 | 0.664 |
| 1616616.0 | 0.666 |
| 1619000.0 | 0.667 |
| 1631000.0 | 0.669 |
| 1635665.0 | 0.671 |
| 1640410.0 | 0.672 |
| 1659340.0 | 0.674 |
| 1663110.0 | 0.676 |
| 1680829.0 | 0.677 |
| 1683935.0 | 0.679 |
| 1694000.0 | 0.681 |
| 1694000.0 | 0.683 |
| 1696890.0 | 0.684 |
| 1697978.0 | 0.686 |
| 1700000.0 | 0.688 |
| 1700011.0 | 0.689 |
| 1715073.0 | 0.691 |
| 1719640.0 | 0.693 |
| 1726129.0 | 0.695 |
| 1729844.0 | 0.696 |
| 1747200.0 | 0.698 |
| 1747441.0 | 0.7 |
| 1748337.0 | 0.701 |
| 1749070.0 | 0.703 |
| 1750000.0 | 0.705 |
| 1752700.0 | 0.707 |
| 1778000.0 | 0.708 |
| 1779038.0 | 0.71 |
| 1784793.0 | 0.712 |
| 1798818.0 | 0.714 |
| 1800000.0 | 0.715 |
| 1800000.0 | 0.717 |
| 1800000.0 | 0.719 |
| 1800000.0 | 0.721 |
| 1800000.0 | 0.722 |
| 1800000.0 | 0.724 |
| 1800925.0 | 0.726 |
| 1815810.0 | 0.728 |
| 1819055.0 | 0.729 |
| 1847160.0 | 0.731 |
| 1849173.0 | 0.733 |
| 1864060.0 | 0.735 |
| 1882380.0 | 0.737 |
| 1894228.0 | 0.738 |
| 1900000.0 | 0.74 |
| 1900000.0 | 0.742 |
| 1903089.0 | 0.744 |
| 1925000.0 | 0.745 |
| 1929000.0 | 0.747 |
| 1935974.0 | 0.749 |
| 1939650.0 | 0.751 |
| 1957395.0 | 0.753 |
| 1958500.0 | 0.754 |
| 1972800.0 | 0.756 |
| 1975157.0 | 0.758 |
| 1975157.0 | 0.76 |
| 1980892.0 | 0.762 |
| 1981978.0 | 0.763 |
| 1987600.0 | 0.765 |
| 1989360.0 | 0.767 |
| 1995651.0 | 0.769 |
| 1999999.0 | 0.771 |
| 2000000.0 | 0.772 |
| 2000000.0 | 0.774 |
| 2000000.0 | 0.776 |
| 2000000.0 | 0.778 |
| 2000000.0 | 0.78 |
| 2000000.0 | 0.782 |
| 2000000.0 | 0.783 |
| 2000000.0 | 0.785 |
| 2000000.0 | 0.787 |
| 2000000.0 | 0.789 |
| 2000000.0 | 0.791 |
| 2000000.0 | 0.793 |
| 2000000.0 | 0.795 |
| 2000000.0 | 0.796 |
| 2000000.0 | 0.798 |
| 2000000.0 | 0.8 |
| 2002000.0 | 0.802 |
| 2025622.0 | 0.804 |
| 2025892.0 | 0.806 |
| 2033500.0 | 0.808 |
| 2039526.0 | 0.809 |
| 2046674.0 | 0.811 |
| 2051058.0 | 0.813 |
| 2082401.0 | 0.815 |
| 2084567.0 | 0.817 |
| 2100000.0 | 0.819 |
| 2100000.0 | 0.821 |
| 2100000.0 | 0.823 |
| 2101177.0 | 0.825 |
| 2110342.0 | 0.826 |
| 2112080.0 | 0.828 |
| 2119298.0 | 0.83 |
| 2131800.0 | 0.832 |
| 2148910.0 | 0.834 |
| 2148910.0 | 0.836 |
| 2156297.0 | 0.838 |
| 2173253.0 | 0.84 |
| 2184938.0 | 0.842 |
| 2192636.0 | 0.844 |
| 2210946.0 | 0.846 |
| 2217000.0 | 0.848 |
| 2237530.0 | 0.85 |
| 2241989.0 | 0.851 |
| 2250000.0 | 0.853 |
| 2268364.0 | 0.855 |
| 2274957.0 | 0.857 |
| 2296036.0 | 0.859 |
| 2300000.0 | 0.861 |
| 2374065.0 | 0.863 |
| 2401202.0 | 0.865 |
| 2415760.0 | 0.867 |
| 2423203.0 | 0.869 |
| 2423679.0 | 0.871 |
| 2441915.0 | 0.873 |
| 2446500.0 | 0.875 |
| 2490430.0 | 0.877 |
| 2494277.0 | 0.879 |
| 2499210.0 | 0.881 |
| 2500000.0 | 0.883 |
| 2500000.0 | 0.885 |
| 2500000.0 | 0.887 |
| 2500000.0 | 0.889 |
| 2500169.0 | 0.891 |
| 2502146.0 | 0.893 |
| 2506116.0 | 0.895 |
| 2520000.0 | 0.897 |
| 2520000.0 | 0.899 |
| 2540301.0 | 0.901 |
| 2565641.0 | 0.903 |
| 2577857.0 | 0.905 |
| 2597280.0 | 0.907 |
| 2600000.0 | 0.909 |
| 2605527.0 | 0.911 |
| 2610000.0 | 0.913 |
| 2628713.0 | 0.915 |
| 2641217.0 | 0.918 |
| 2645072.0 | 0.92 |
| 2649000.0 | 0.922 |
| 2650926.0 | 0.924 |
| 2652000.0 | 0.926 |
| 2658746.0 | 0.928 |
| 2683400.0 | 0.93 |
| 2694891.0 | 0.932 |
| 2699363.0 | 0.934 |
| 2700000.0 | 0.936 |
| 2719554.0 | 0.938 |
| 2722939.0 | 0.94 |
| 2736543.0 | 0.943 |
| 2749201.0 | 0.945 |
| 2750000.0 | 0.947 |
| 2761002.0 | 0.949 |
| 2773069.0 | 0.951 |
| 2849411.0 | 0.953 |
| 2882369.0 | 0.955 |
| 2899727.0 | 0.957 |
| 2901632.0 | 0.96 |
| 2914000.0 | 0.962 |
| 2934056.0 | 0.964 |
| 2935048.0 | 0.966 |
| 2940000.0 | 0.968 |
| 2947181.0 | 0.97 |
| 2950000.0 | 0.972 |
| 2950500.0 | 0.975 |
| 2968172.0 | 0.977 |
| 2968493.0 | 0.979 |
| 2968952.0 | 0.981 |
| 2970000.0 | 0.983 |
| 2989138.0 | 0.986 |
| 2999047.0 | 0.988 |
| 2999422.0 | 0.99 |
| 2999730.0 | 0.992 |
| 2999960.0 | 0.994 |
| 3000000.0 | 0.997 |
| 3000000.0 | 0.999 |
| 3000000.0 | 1.001 |
| 3000000.0 | 1.003 |
| 3000000.0 | 1.006 |
| 3000000.0 | 1.008 |
| 3000000.0 | 1.01 |
| 3000000.0 | 1.012 |
| 3000000.0 | 1.015 |
| 3000000.0 | 1.017 |
| 3000000.0 | 1.019 |
| 3000000.0 | 1.021 |
| 3000165.0 | 1.024 |
| 3000695.0 | 1.026 |
| 3002252.0 | 1.028 |
| 3004365.0 | 1.031 |
| 3024695.0 | 1.033 |
| 3062093.0 | 1.035 |
| 3079800.0 | 1.037 |
| 3086347.0 | 1.04 |
| 3095593.0 | 1.042 |
| 3114736.0 | 1.044 |
| 3120000.0 | 1.047 |
| 3179363.0 | 1.049 |
| 3187000.0 | 1.051 |
| 3197931.0 | 1.054 |
| 3200000.0 | 1.056 |
| 3200000.0 | 1.059 |
| 3200004.0 | 1.061 |
| 3201953.0 | 1.063 |
| 3204132.0 | 1.066 |
| 3213686.0 | 1.068 |
| 3230000.0 | 1.07 |
| 3243431.0 | 1.073 |
| 3249835.0 | 1.075 |
| 3250000.0 | 1.078 |
| 3264920.0 | 1.08 |
| 3265453.0 | 1.083 |
| 3295118.0 | 1.085 |
| 3325000.0 | 1.087 |
| 3349200.0 | 1.09 |
| 3360000.0 | 1.092 |
| 3380890.0 | 1.095 |
| 3402417.0 | 1.097 |
| 3416901.0 | 1.1 |
| 3427323.0 | 1.102 |
| 3427323.0 | 1.105 |
| 3468005.0 | 1.107 |
| 3476300.0 | 1.11 |
| 3487270.0 | 1.112 |
| 3498875.0 | 1.115 |
| 3500000.0 | 1.117 |
| 3500000.0 | 1.12 |
| 3500000.0 | 1.122 |
| 3500000.0 | 1.125 |
| 3500858.0 | 1.127 |
| 3520290.0 | 1.13 |
| 3525000.0 | 1.133 |
| 3527240.0 | 1.135 |
| 3547119.0 | 1.138 |
| 3578639.0 | 1.14 |
| 3595070.0 | 1.143 |
| 3600000.0 | 1.145 |
| 3600000.0 | 1.148 |
| 3613200.0 | 1.151 |
| 3615655.0 | 1.153 |
| 3632666.0 | 1.156 |
| 3640000.0 | 1.159 |
| 3700000.0 | 1.161 |
| 3700737.0 | 1.164 |
| 3714566.0 | 1.167 |
| 3743337.0 | 1.169 |
| 3768084.0 | 1.172 |
| 3772190.0 | 1.175 |
| 3774912.0 | 1.177 |
| 3775000.0 | 1.18 |
| 3779763.0 | 1.183 |
| 3878680.0 | 1.185 |
| 3882600.0 | 1.188 |
| 3920038.0 | 1.191 |
| 3950000.0 | 1.194 |
| 3950523.0 | 1.196 |
| 3956061.0 | 1.199 |
| 3998633.0 | 1.202 |
| 3999127.0 | 1.205 |
| 4000000.0 | 1.208 |
| 4000000.0 | 1.21 |
| 4000000.0 | 1.213 |
| 4000000.0 | 1.216 |
| 4000000.0 | 1.219 |
| 4000000.0 | 1.222 |
| 4000000.0 | 1.225 |
| 4000000.0 | 1.227 |
| 4000000.0 | 1.23 |
| 4001263.0 | 1.233 |
| 4001999.0 | 1.236 |
| 4021725.0 | 1.239 |
| 4030207.0 | 1.242 |
| 4042920.0 | 1.245 |
| 4079157.0 | 1.248 |
| 4079361.0 | 1.251 |
| 4110000.0 | 1.254 |
| 4114700.0 | 1.257 |
| 4200000.0 | 1.26 |
| 4200000.0 | 1.263 |
| 4290220.0 | 1.266 |
| 4326400.0 | 1.269 |
| 4336500.0 | 1.272 |
| 4342988.0 | 1.275 |
| 4353830.0 | 1.278 |
| 4371831.0 | 1.281 |
| 4400000.0 | 1.284 |
| 4425000.0 | 1.287 |
| 4430000.0 | 1.29 |
| 4463541.0 | 1.293 |
| 4475911.0 | 1.296 |
| 4476761.0 | 1.3 |
| 4500000.0 | 1.303 |
| 4500000.0 | 1.306 |
| 4500000.0 | 1.309 |
| 4511611.0 | 1.312 |
| 4560000.0 | 1.315 |
| 4665344.0 | 1.319 |
| 4800000.0 | 1.322 |
| 4808246.0 | 1.325 |
| 4837214.0 | 1.328 |
| 4850460.0 | 1.332 |
| 4873500.0 | 1.335 |
| 4934800.0 | 1.338 |
| 4974112.0 | 1.342 |
| 4989262.0 | 1.345 |
| 4992043.0 | 1.348 |
| 4998000.0 | 1.352 |
| 4999767.0 | 1.355 |
| 5000000.0 | 1.358 |
| 5000000.0 | 1.362 |
| 5000000.0 | 1.365 |
| 5000000.0 | 1.369 |
| 5000000.0 | 1.372 |
| 5082777.0 | 1.376 |
| 5100000.0 | 1.379 |
| 5100000.0 | 1.383 |
| 5115250.0 | 1.386 |
| 5150000.0 | 1.39 |
| 5151110.0 | 1.393 |
| 5151834.0 | 1.397 |
| 5189705.0 | 1.401 |
| 5197878.0 | 1.404 |
| 5218424.0 | 1.408 |
| 5226127.0 | 1.411 |
| 5283589.0 | 1.415 |
| 5339692.0 | 1.419 |
| 5339692.0 | 1.422 |
| 5411496.0 | 1.426 |
| 5420332.0 | 1.43 |
| 5482457.0 | 1.434 |
| 5483812.0 | 1.438 |
| 5499727.0 | 1.441 |
| 5511184.0 | 1.445 |
| 5542579.0 | 1.449 |
| 5549352.0 | 1.453 |
| 5603000.0 | 1.457 |
| 5620200.0 | 1.461 |
| 5664388.0 | 1.465 |
| 5727043.0 | 1.469 |
| 5760000.0 | 1.473 |
| 5767457.0 | 1.477 |
| 5799040.0 | 1.481 |
| 5901503.0 | 1.485 |
| 5907665.0 | 1.489 |
| 5908302.0 | 1.493 |
| 5914021.0 | 1.497 |
| 5992250.0 | 1.501 |
| 6000000.0 | 1.505 |
| 6000000.0 | 1.51 |
| 6000067.0 | 1.514 |
| 6000576.0 | 1.518 |
| 6080340.0 | 1.522 |
| 6094497.0 | 1.527 |
| 6122614.0 | 1.531 |
| 6300000.0 | 1.535 |
| 6336481.0 | 1.54 |
| 6500000.0 | 1.544 |
| 6550516.0 | 1.549 |
| 6721800.0 | 1.553 |
| 6750000.0 | 1.558 |
| 6752627.0 | 1.562 |
| 6861999.0 | 1.567 |
| 6900000.0 | 1.572 |
| 6929430.0 | 1.576 |
| 7000000.0 | 1.581 |
| 7000000.0 | 1.586 |
| 7000000.0 | 1.591 |
| 7000000.0 | 1.595 |
| 7000000.0 | 1.6 |
| 7023100.0 | 1.605 |
| 7023100.0 | 1.61 |
| 7030400.0 | 1.615 |
| 7090167.0 | 1.62 |
| 7351708.0 | 1.625 |
| 7500000.0 | 1.63 |
| 7559200.0 | 1.635 |
| 7611775.0 | 1.64 |
| 7613637.0 | 1.646 |
| 7662894.0 | 1.651 |
| 7697323.0 | 1.656 |
| 7750000.0 | 1.662 |
| 7750417.0 | 1.667 |
| 7910896.0 | 1.672 |
| 7913604.0 | 1.678 |
| 7945004.0 | 1.683 |
| 7999978.0 | 1.689 |
| 8000000.0 | 1.695 |
| 8003846.0 | 1.7 |
| 8062122.0 | 1.706 |
| 8089831.0 | 1.712 |
| 8149935.0 | 1.718 |
| 8300000.0 | 1.724 |
| 8474994.0 | 1.73 |
| 8873335.0 | 1.736 |
| 8959808.0 | 1.742 |
| 8999972.0 | 1.748 |
| 9000000.0 | 1.755 |
| 9297699.0 | 1.761 |
| 9364000.0 | 1.767 |
| 9382373.0 | 1.774 |
| 9388911.0 | 1.78 |
| 9446532.0 | 1.787 |
| 9490475.0 | 1.794 |
| 9602735.0 | 1.801 |
| 9675588.0 | 1.807 |
| 9707210.0 | 1.814 |
| 9800000.0 | 1.821 |
| 9800877.0 | 1.829 |
| 9856000.0 | 1.836 |
| 9900000.0 | 1.843 |
| 9900000.0 | 1.851 |
| 9961842.0 | 1.858 |
| 9967084.0 | 1.866 |
| 9984927.0 | 1.874 |
| 10000000.0 | 1.882 |
| 10000000.0 | 1.89 |
| 10000000.0 | 1.898 |
| 10000000.0 | 1.906 |
| 10000000.0 | 1.914 |
| 10000000.0 | 1.923 |
| 10000000.0 | 1.931 |
| 10000139.0 | 1.94 |
| 10119000.0 | 1.949 |
| 10300300.0 | 1.958 |
| 10355535.0 | 1.968 |
| 10562800.0 | 1.977 |
| 11013694.0 | 1.987 |
| 11437987.0 | 1.997 |
| 11480000.0 | 2.007 |
| 11521425.0 | 2.017 |
| 11750000.0 | 2.027 |
| 12000000.0 | 2.038 |
| 12000000.0 | 2.049 |
| 12000000.0 | 2.06 |
| 12207733.0 | 2.071 |
| 12500000.0 | 2.083 |
| 12567173.0 | 2.095 |
| 12660353.0 | 2.107 |
| 12704649.0 | 2.12 |
| 13115049.0 | 2.133 |
| 13568880.0 | 2.146 |
| 13669000.0 | 2.16 |
| 13675486.0 | 2.174 |
| 13763544.0 | 2.189 |
| 14000000.0 | 2.204 |
| 14130000.0 | 2.22 |
| 14518052.0 | 2.236 |
| 15000000.0 | 2.253 |
| 15206150.0 | 2.27 |
| 15860000.0 | 2.288 |
| 16294847.0 | 2.307 |
| 17250000.0 | 2.327 |
| 18743505.0 | 2.348 |
| 20000000.0 | 2.37 |
| 20000000.0 | 2.393 |
| 20283334.0 | 2.417 |
| 21574274.0 | 2.443 |
| 22262000.0 | 2.471 |
| 23239450.0 | 2.5 |
| 25000000.0 | 2.532 |
| 25085998.0 | 2.567 |
| 25106639.0 | 2.605 |
| 25464998.0 | 2.648 |
| 27640000.0 | 2.696 |
| 35000400.0 | 2.751 |
| 40000000.0 | 2.816 |
| 45012830.0 | 2.896 |
| 87333334.0 | 3 |
| 90000000.0 | 3.152 |
| 100000000.0 | 3.46 |